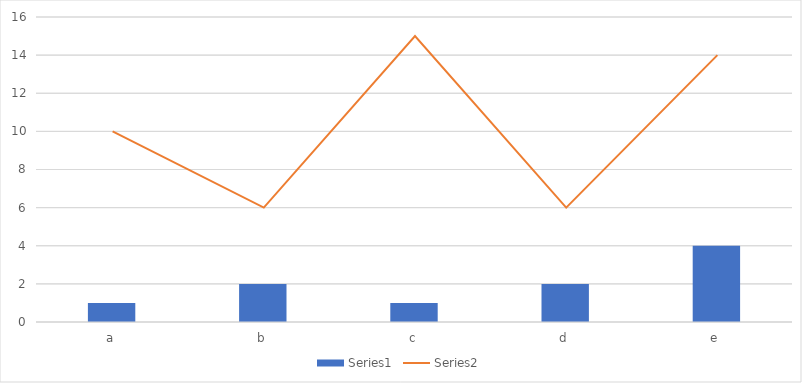
| Category | Series 0 |
|---|---|
| a | 1 |
| b | 2 |
| c | 1 |
| d | 2 |
| e | 4 |